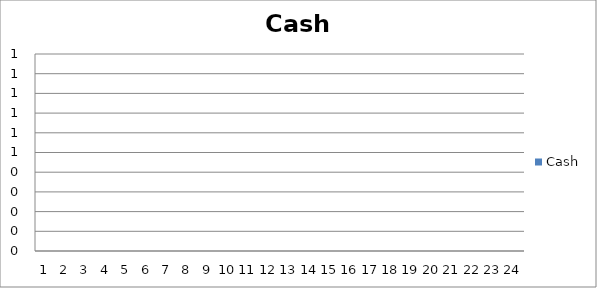
| Category | Cash |
|---|---|
| 0 | 0 |
| 1 | 0 |
| 2 | 0 |
| 3 | 0 |
| 4 | 0 |
| 5 | 0 |
| 6 | 0 |
| 7 | 0 |
| 8 | 0 |
| 9 | 0 |
| 10 | 0 |
| 11 | 0 |
| 12 | 0 |
| 13 | 0 |
| 14 | 0 |
| 15 | 0 |
| 16 | 0 |
| 17 | 0 |
| 18 | 0 |
| 19 | 0 |
| 20 | 0 |
| 21 | 0 |
| 22 | 0 |
| 23 | 0 |